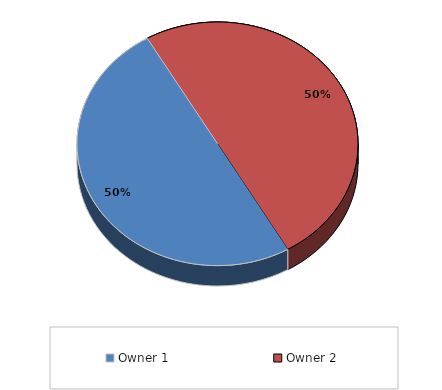
| Category | Series 0 |
|---|---|
| Owner 1 | 0.5 |
| Owner 2 | 0.5 |